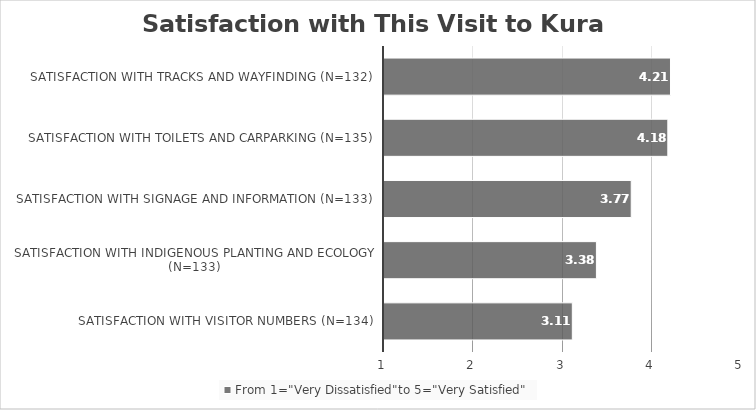
| Category | From 1="Very Dissatisfied"to 5="Very Satisfied" |
|---|---|
| Satisfaction with visitor numbers (N=134) | 3.11 |
| Satisfaction with indigenous planting and ecology (N=133) | 3.38 |
| Satisfaction with signage and information (N=133) | 3.77 |
| Satisfaction with toilets and carparking (N=135) | 4.18 |
| Satisfaction with tracks and wayfinding (N=132) | 4.21 |